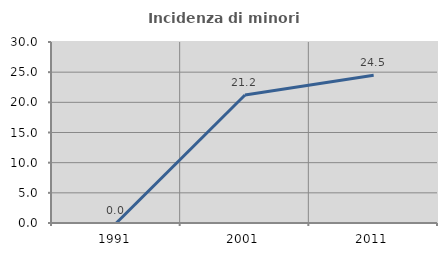
| Category | Incidenza di minori stranieri |
|---|---|
| 1991.0 | 0 |
| 2001.0 | 21.212 |
| 2011.0 | 24.49 |